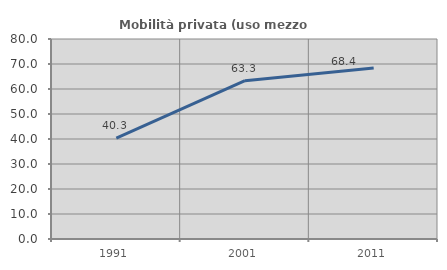
| Category | Mobilità privata (uso mezzo privato) |
|---|---|
| 1991.0 | 40.312 |
| 2001.0 | 63.313 |
| 2011.0 | 68.39 |